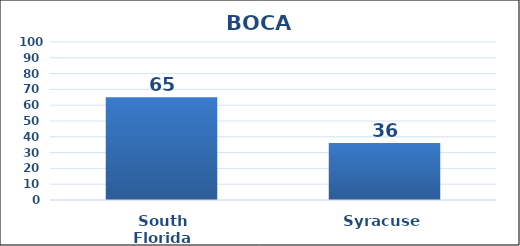
| Category | Series 0 |
|---|---|
| South Florida | 65 |
| Syracuse | 36 |